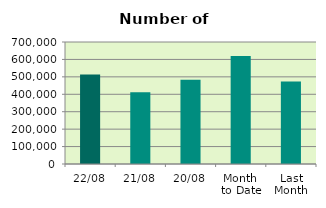
| Category | Series 0 |
|---|---|
| 22/08 | 513692 |
| 21/08 | 411470 |
| 20/08 | 483058 |
| Month 
to Date | 619480.125 |
| Last
Month | 472929.565 |